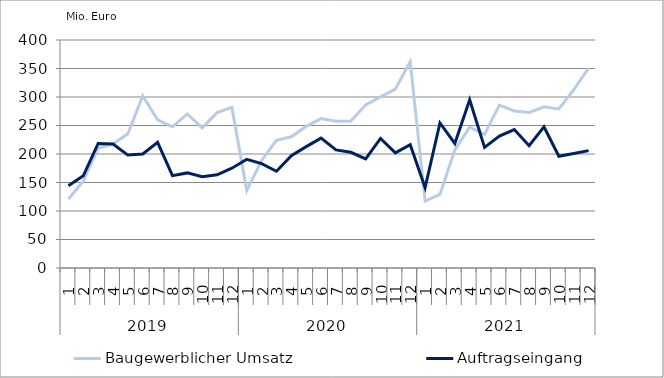
| Category | Baugewerblicher Umsatz | Auftragseingang |
|---|---|---|
| 0 | 120975.133 | 144510.881 |
| 1 | 152329.786 | 161685.201 |
| 2 | 210227.67 | 218455.879 |
| 3 | 217522.321 | 217610.064 |
| 4 | 235490.429 | 198110.439 |
| 5 | 301963.302 | 200012.086 |
| 6 | 259975.317 | 220559.061 |
| 7 | 247779.658 | 162059.723 |
| 8 | 270249.609 | 166829.611 |
| 9 | 245966.91 | 160120.773 |
| 10 | 272620.351 | 163589.389 |
| 11 | 281810.121 | 175051.247 |
| 12 | 136135.432 | 190647.086 |
| 13 | 188682.361 | 183141.14 |
| 14 | 224009.315 | 169770.009 |
| 15 | 230172.252 | 196979.845 |
| 16 | 248410.714 | 212955.83 |
| 17 | 262078.128 | 227853.487 |
| 18 | 257360.37 | 207209.188 |
| 19 | 257932.168 | 202976.091 |
| 20 | 285866.269 | 191463.844 |
| 21 | 300164.57 | 227245.467 |
| 22 | 313922.518 | 202060.636 |
| 23 | 362040.738 | 216296.504 |
| 24 | 117421.805 | 141020.655 |
| 25 | 129162.55 | 254416.876 |
| 26 | 207280.837 | 218451.405 |
| 27 | 247094.279 | 295077.868 |
| 28 | 234515.312 | 211696.129 |
| 29 | 285732.845 | 231455.155 |
| 30 | 275480.885 | 242932.505 |
| 31 | 272787.524 | 214636.944 |
| 32 | 282850.254 | 247827.991 |
| 33 | 279173.21 | 196069.238 |
| 34 | 312511.437 | 201015.897 |
| 35 | 350582.01 | 205949.991 |